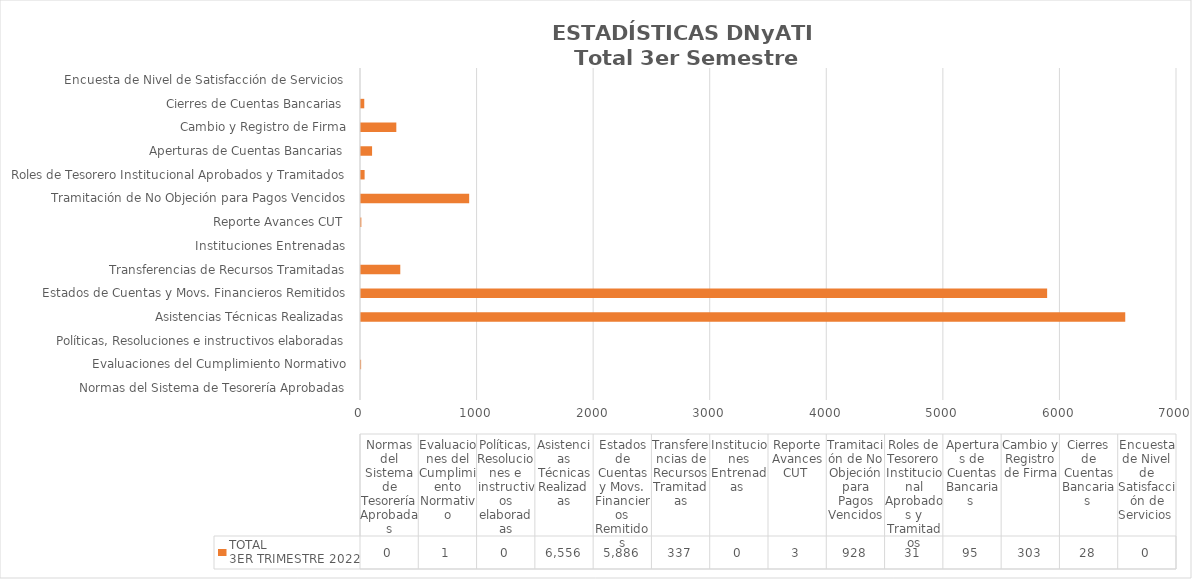
| Category | TOTAL
3ER TRIMESTRE 2022 |
|---|---|
| Normas del Sistema de Tesorería Aprobadas | 0 |
| Evaluaciones del Cumplimiento Normativo | 1 |
| Políticas, Resoluciones e instructivos elaboradas | 0 |
| Asistencias Técnicas Realizadas | 6556 |
| Estados de Cuentas y Movs. Financieros Remitidos | 5886 |
| Transferencias de Recursos Tramitadas | 337 |
| Instituciones Entrenadas  | 0 |
| Reporte Avances CUT  | 3 |
| Tramitación de No Objeción para Pagos Vencidos | 928 |
| Roles de Tesorero Institucional Aprobados y Tramitados | 31 |
| Aperturas de Cuentas Bancarias  | 95 |
| Cambio y Registro de Firma | 303 |
| Cierres de Cuentas Bancarias  | 28 |
| Encuesta de Nivel de Satisfacción de Servicios  | 0 |